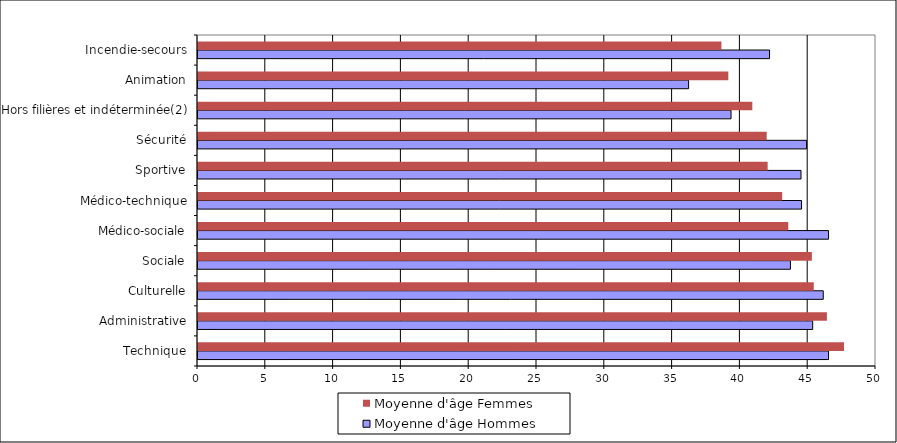
| Category | Moyenne d'âge |
|---|---|
| Technique | 47.64 |
| Administrative | 46.38 |
| Culturelle | 45.41 |
| Sociale | 45.27 |
| Médico-sociale | 43.53 |
| Médico-technique | 43.08 |
| Sportive | 42.01 |
| Sécurité | 41.94 |
| Hors filières et indéterminée(2) | 40.88 |
| Animation | 39.11 |
| Incendie-secours | 38.6 |